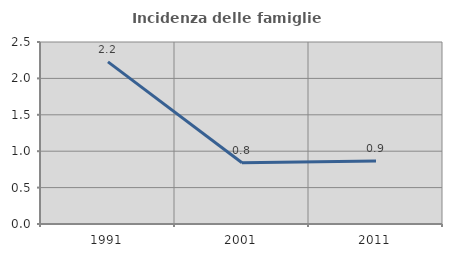
| Category | Incidenza delle famiglie numerose |
|---|---|
| 1991.0 | 2.227 |
| 2001.0 | 0.841 |
| 2011.0 | 0.867 |